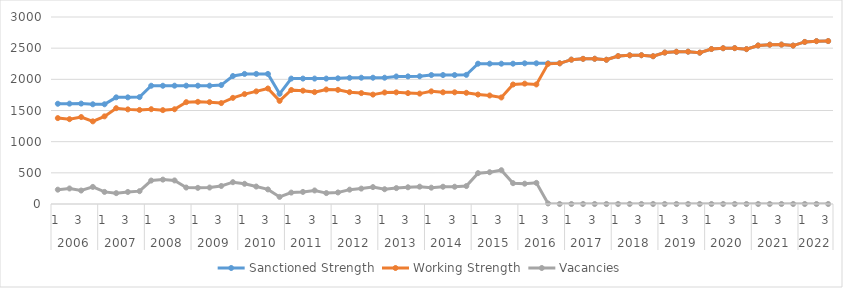
| Category | Sanctioned Strength | Working Strength | Vacancies |
|---|---|---|---|
| 0 | 1608 | 1378 | 230 |
| 1 | 1610 | 1361 | 249 |
| 2 | 1611 | 1395 | 216 |
| 3 | 1600 | 1326 | 274 |
| 4 | 1600 | 1406 | 194 |
| 5 | 1711 | 1537 | 174 |
| 6 | 1711 | 1518 | 193 |
| 7 | 1715 | 1509 | 206 |
| 8 | 1897 | 1521 | 376 |
| 9 | 1897 | 1506 | 391 |
| 10 | 1898 | 1520 | 378 |
| 11 | 1898 | 1634 | 264 |
| 12 | 1898 | 1639 | 259 |
| 13 | 1898 | 1634 | 264 |
| 14 | 1908 | 1619 | 289 |
| 15 | 2053 | 1703 | 350 |
| 16 | 2087 | 1763 | 324 |
| 17 | 2087 | 1807 | 280 |
| 18 | 2087 | 1853 | 234 |
| 19 | 1768 | 1654 | 114 |
| 20 | 2012 | 1829 | 183 |
| 21 | 2012 | 1818 | 194 |
| 22 | 2012 | 1795 | 217 |
| 23 | 2012 | 1837 | 175 |
| 24 | 2016 | 1831 | 185 |
| 25 | 2024 | 1794 | 230 |
| 26 | 2026 | 1779 | 247 |
| 27 | 2026 | 1755 | 271 |
| 28 | 2026 | 1789 | 237 |
| 29 | 2046 | 1791 | 255 |
| 30 | 2047 | 1779 | 268 |
| 31 | 2049 | 1771 | 278 |
| 32 | 2069 | 1807 | 262 |
| 33 | 2069 | 1792 | 277 |
| 34 | 2069 | 1792 | 277 |
| 35 | 2072 | 1784 | 288 |
| 36 | 2251 | 1756 | 495 |
| 37 | 2251 | 1741 | 510 |
| 38 | 2251 | 1709 | 542 |
| 39 | 2251 | 1917 | 334 |
| 40 | 2257 | 1931 | 326 |
| 41 | 2257 | 1918 | 339 |
| 42 | 2257 | 2248 | 9 |
| 43 | 2257.093 | 2257.093 | 0 |
| 44 | 2315.756 | 2315.756 | 0 |
| 45 | 2328.575 | 2328.575 | 0 |
| 46 | 2329.938 | 2329.938 | 0 |
| 47 | 2313.947 | 2313.947 | 0 |
| 48 | 2372.61 | 2372.61 | 0 |
| 49 | 2385.428 | 2385.428 | 0 |
| 50 | 2386.792 | 2386.792 | 0 |
| 51 | 2370.8 | 2370.8 | 0 |
| 52 | 2429.463 | 2429.463 | 0 |
| 53 | 2442.281 | 2442.281 | 0 |
| 54 | 2443.645 | 2443.645 | 0 |
| 55 | 2427.653 | 2427.653 | 0 |
| 56 | 2486.316 | 2486.316 | 0 |
| 57 | 2499.135 | 2499.135 | 0 |
| 58 | 2500.498 | 2500.498 | 0 |
| 59 | 2484.507 | 2484.507 | 0 |
| 60 | 2543.17 | 2543.17 | 0 |
| 61 | 2555.988 | 2555.988 | 0 |
| 62 | 2557.352 | 2557.352 | 0 |
| 63 | 2541.36 | 2541.36 | 0 |
| 64 | 2600.023 | 2600.023 | 0 |
| 65 | 2612.841 | 2612.841 | 0 |
| 66 | 2614.205 | 2614.205 | 0 |